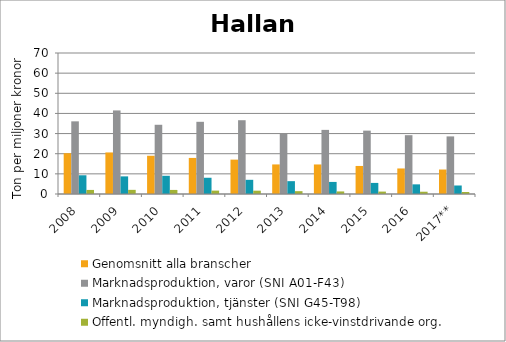
| Category | Genomsnitt alla branscher | Marknadsproduktion, varor (SNI A01-F43) | Marknadsproduktion, tjänster (SNI G45-T98) | Offentl. myndigh. samt hushållens icke-vinstdrivande org. |
|---|---|---|---|---|
| 2008 | 20.249 | 36.075 | 9.296 | 2.022 |
| 2009 | 20.632 | 41.488 | 8.746 | 2.057 |
| 2010 | 18.984 | 34.367 | 9.042 | 2.022 |
| 2011 | 17.908 | 35.841 | 8.065 | 1.683 |
| 2012 | 17.064 | 36.63 | 7.043 | 1.647 |
| 2013 | 14.68 | 29.792 | 6.375 | 1.405 |
| 2014 | 14.666 | 31.831 | 5.996 | 1.275 |
| 2015 | 13.924 | 31.455 | 5.504 | 1.199 |
| 2016 | 12.679 | 29.199 | 4.792 | 1.132 |
| 2017** | 12.15 | 28.592 | 4.224 | 0.992 |